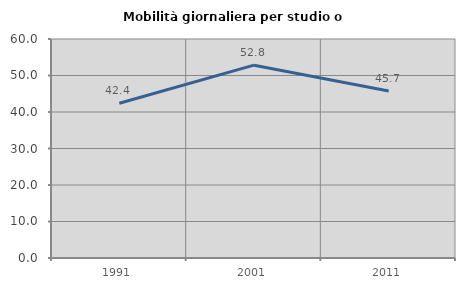
| Category | Mobilità giornaliera per studio o lavoro |
|---|---|
| 1991.0 | 42.412 |
| 2001.0 | 52.83 |
| 2011.0 | 45.749 |